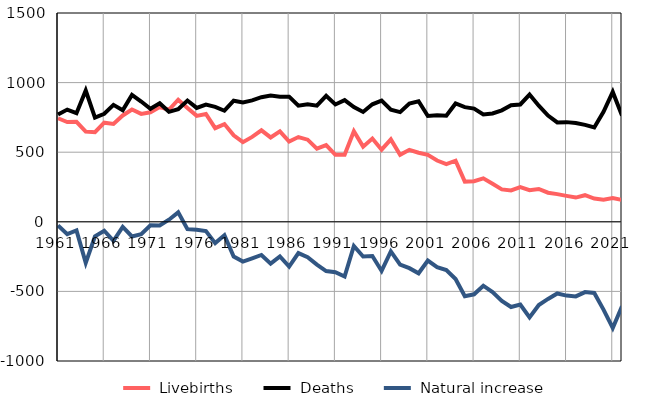
| Category |  Livebirths |  Deaths |  Natural increase |
|---|---|---|---|
| 1961.0 | 744 | 770 | -26 |
| 1962.0 | 717 | 806 | -89 |
| 1963.0 | 718 | 780 | -62 |
| 1964.0 | 648 | 943 | -295 |
| 1965.0 | 644 | 749 | -105 |
| 1966.0 | 712 | 776 | -64 |
| 1967.0 | 703 | 840 | -137 |
| 1968.0 | 764 | 801 | -37 |
| 1969.0 | 807 | 912 | -105 |
| 1970.0 | 775 | 864 | -89 |
| 1971.0 | 787 | 812 | -25 |
| 1972.0 | 824 | 851 | -27 |
| 1973.0 | 805 | 790 | 15 |
| 1974.0 | 877 | 809 | 68 |
| 1975.0 | 818 | 871 | -53 |
| 1976.0 | 761 | 818 | -57 |
| 1977.0 | 775 | 842 | -67 |
| 1978.0 | 673 | 826 | -153 |
| 1979.0 | 702 | 798 | -96 |
| 1980.0 | 621 | 870 | -249 |
| 1981.0 | 572 | 858 | -286 |
| 1982.0 | 610 | 872 | -262 |
| 1983.0 | 657 | 895 | -238 |
| 1984.0 | 606 | 907 | -301 |
| 1985.0 | 650 | 899 | -249 |
| 1986.0 | 577 | 899 | -322 |
| 1987.0 | 609 | 834 | -225 |
| 1988.0 | 590 | 845 | -255 |
| 1989.0 | 526 | 834 | -308 |
| 1990.0 | 551 | 905 | -354 |
| 1991.0 | 481 | 843 | -362 |
| 1992.0 | 481 | 874 | -393 |
| 1993.0 | 650 | 824 | -174 |
| 1994.0 | 540 | 789 | -249 |
| 1995.0 | 598 | 844 | -246 |
| 1996.0 | 518 | 871 | -353 |
| 1997.0 | 592 | 805 | -213 |
| 1998.0 | 481 | 788 | -307 |
| 1999.0 | 517 | 850 | -333 |
| 2000.0 | 496 | 866 | -370 |
| 2001.0 | 481 | 760 | -279 |
| 2002.0 | 440 | 766 | -326 |
| 2003.0 | 415 | 762 | -347 |
| 2004.0 | 439 | 850 | -411 |
| 2005.0 | 289 | 824 | -535 |
| 2006.0 | 292 | 813 | -521 |
| 2007.0 | 312 | 771 | -459 |
| 2008.0 | 273 | 778 | -505 |
| 2009.0 | 233 | 801 | -568 |
| 2010.0 | 225 | 837 | -612 |
| 2011.0 | 249 | 843 | -594 |
| 2012.0 | 227 | 914 | -687 |
| 2013.0 | 236 | 834 | -598 |
| 2014.0 | 209 | 763 | -554 |
| 2015.0 | 199 | 714 | -515 |
| 2016.0 | 186 | 716 | -530 |
| 2017.0 | 174 | 710 | -536 |
| 2018.0 | 191 | 696 | -505 |
| 2019.0 | 167 | 678 | -511 |
| 2020.0 | 159 | 790 | -631 |
| 2021.0 | 170 | 933 | -763 |
| 2022.0 | 157 | 763 | -606 |